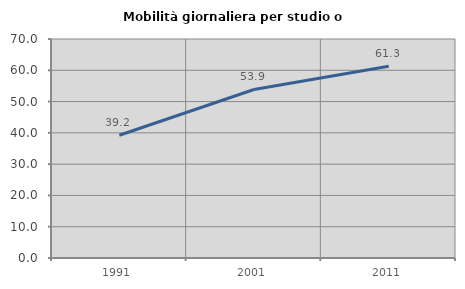
| Category | Mobilità giornaliera per studio o lavoro |
|---|---|
| 1991.0 | 39.223 |
| 2001.0 | 53.862 |
| 2011.0 | 61.263 |